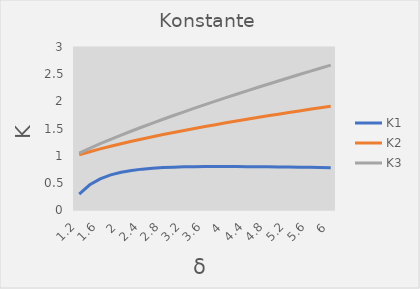
| Category | K1 | K2 | K3 |
|---|---|---|---|
| 1.2 | 0.291 | 1.016 | 1.048 |
| 1.4 | 0.464 | 1.072 | 1.136 |
| 1.6 | 0.574 | 1.124 | 1.22 |
| 1.8 | 0.646 | 1.174 | 1.3 |
| 2.0 | 0.695 | 1.22 | 1.378 |
| 2.2 | 0.728 | 1.265 | 1.454 |
| 2.4 | 0.752 | 1.308 | 1.528 |
| 2.6 | 0.769 | 1.349 | 1.6 |
| 2.8 | 0.78 | 1.389 | 1.67 |
| 3.0 | 0.788 | 1.427 | 1.739 |
| 3.2 | 0.794 | 1.464 | 1.807 |
| 3.4 | 0.797 | 1.501 | 1.874 |
| 3.6 | 0.799 | 1.536 | 1.939 |
| 3.8 | 0.8 | 1.571 | 2.004 |
| 4.0 | 0.8 | 1.604 | 2.068 |
| 4.2 | 0.799 | 1.638 | 2.13 |
| 4.4 | 0.798 | 1.67 | 2.192 |
| 4.6 | 0.796 | 1.702 | 2.254 |
| 4.8 | 0.794 | 1.733 | 2.315 |
| 5.0 | 0.792 | 1.763 | 2.375 |
| 5.2 | 0.79 | 1.794 | 2.434 |
| 5.4 | 0.787 | 1.823 | 2.493 |
| 5.6 | 0.785 | 1.852 | 2.551 |
| 5.8 | 0.782 | 1.881 | 2.609 |
| 6.0 | 0.779 | 1.91 | 2.666 |